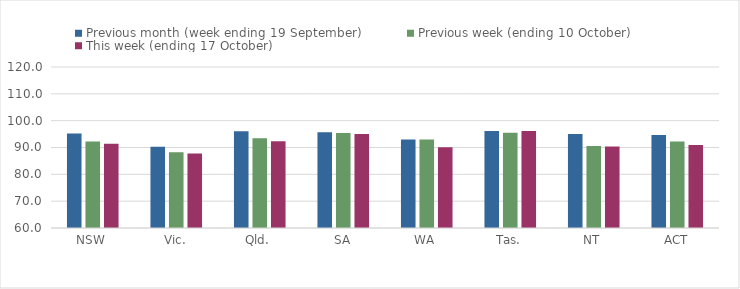
| Category | Previous month (week ending 19 September) | Previous week (ending 10 October) | This week (ending 17 October) |
|---|---|---|---|
| NSW | 95.23 | 92.22 | 91.44 |
| Vic. | 90.29 | 88.19 | 87.77 |
| Qld. | 96.06 | 93.46 | 92.33 |
| SA | 95.68 | 95.43 | 95.05 |
| WA | 93.01 | 92.97 | 90.11 |
| Tas. | 96.12 | 95.5 | 96.13 |
| NT | 95.01 | 90.55 | 90.37 |
| ACT | 94.69 | 92.23 | 90.91 |